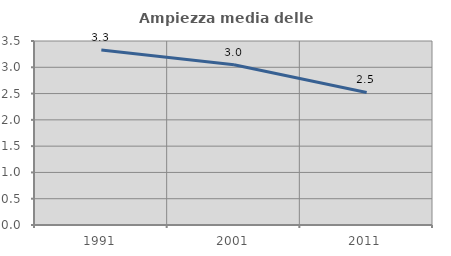
| Category | Ampiezza media delle famiglie |
|---|---|
| 1991.0 | 3.329 |
| 2001.0 | 3.05 |
| 2011.0 | 2.522 |